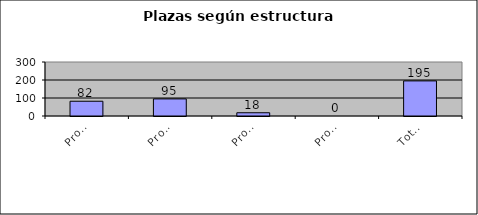
| Category | Series 0 |
|---|---|
| Programa I: Dirección y Administración General | 82 |
| Programa II: Servicios Comunitarios | 95 |
| Programa III: Inversiones | 18 |
| Programa IV: Partidas específicas | 0 |
| Total de plazas | 195 |